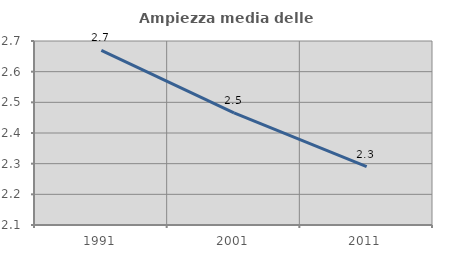
| Category | Ampiezza media delle famiglie |
|---|---|
| 1991.0 | 2.669 |
| 2001.0 | 2.466 |
| 2011.0 | 2.29 |